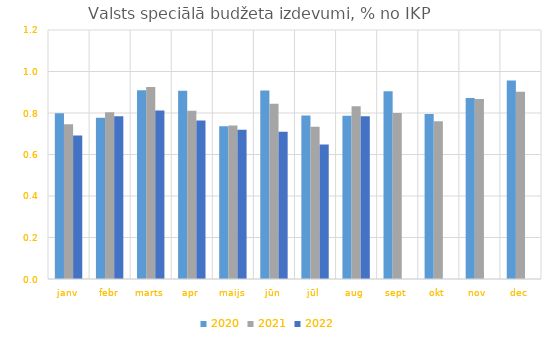
| Category | 2020 | 2021 | 2022 |
|---|---|---|---|
| janv | 0.799 | 0.746 | 0.692 |
| febr | 0.777 | 0.804 | 0.785 |
| marts | 0.91 | 0.926 | 0.812 |
| apr | 0.908 | 0.81 | 0.764 |
| maijs | 0.736 | 0.74 | 0.719 |
| jūn | 0.909 | 0.845 | 0.71 |
| jūl | 0.787 | 0.733 | 0.649 |
| aug | 0.786 | 0.832 | 0.784 |
| sept | 0.904 | 0.8 | 0 |
| okt | 0.795 | 0.76 | 0 |
| nov | 0.873 | 0.867 | 0 |
| dec | 0.957 | 0.903 | 0 |